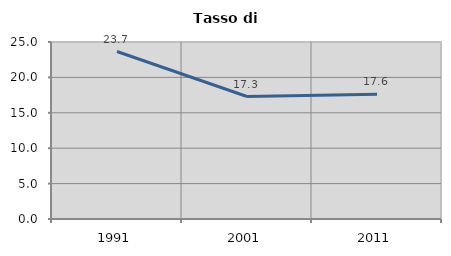
| Category | Tasso di disoccupazione   |
|---|---|
| 1991.0 | 23.656 |
| 2001.0 | 17.3 |
| 2011.0 | 17.612 |